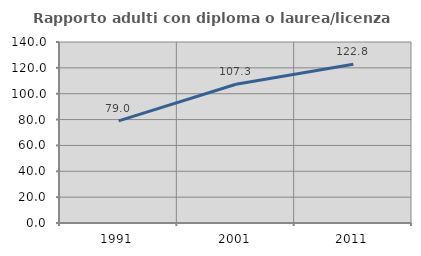
| Category | Rapporto adulti con diploma o laurea/licenza media  |
|---|---|
| 1991.0 | 78.95 |
| 2001.0 | 107.309 |
| 2011.0 | 122.833 |